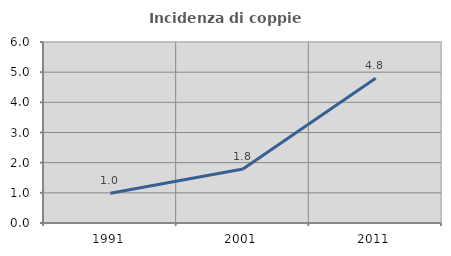
| Category | Incidenza di coppie miste |
|---|---|
| 1991.0 | 0.985 |
| 2001.0 | 1.791 |
| 2011.0 | 4.802 |